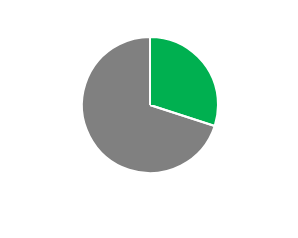
| Category | Series 1 | Series 0 |
|---|---|---|
| Time saved with Power-user | 0.3 | 0.35 |
| Incompressible time | 0.7 | 0.65 |